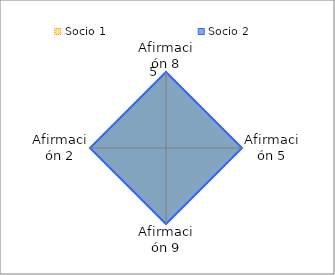
| Category | Socio 1 | Socio 2 |
|---|---|---|
| Afirmación 8 | 5 | 5 |
| Afirmación 5 | 5 | 5 |
| Afirmación 9 | 5 | 5 |
| Afirmación 2 | 5 | 5 |